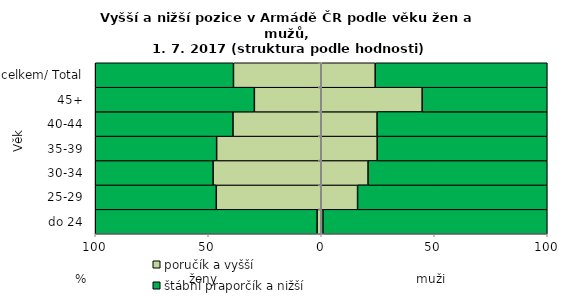
| Category | poručík a vyšší | štábní praporčík a nižší | poručík a vyšší/ leutenant and higher | štábní praporčík a nižší/ staff warrant officer and lower |
|---|---|---|---|---|
| do 24 | -1.852 | -98.148 | 0.762 | 99.238 |
| 25-29 | -46.44 | -53.56 | 16.072 | 83.928 |
| 30-34 | -47.871 | -52.129 | 20.704 | 79.296 |
| 35-39 | -46.282 | -53.718 | 24.749 | 75.251 |
| 40-44 | -39.056 | -60.944 | 24.698 | 75.302 |
| 45+ | -29.593 | -70.407 | 44.642 | 55.358 |
| celkem/ Total | -38.835 | -61.165 | 23.87 | 76.13 |